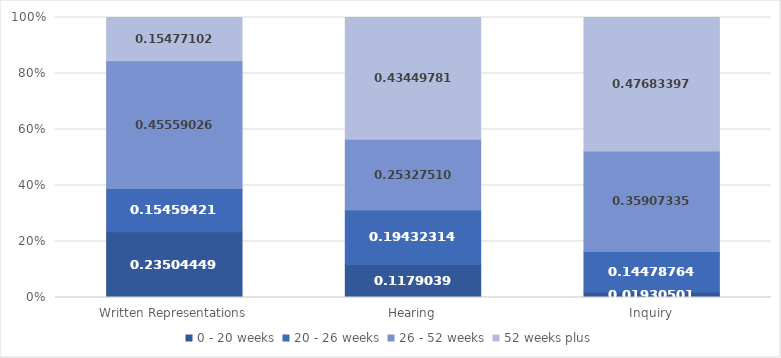
| Category | 0 - 20 weeks | 20 - 26 weeks | 26 - 52 weeks | 52 weeks plus |
|---|---|---|---|---|
| Written Representations | 0.235 | 0.155 | 0.456 | 0.155 |
| Hearing | 0.118 | 0.194 | 0.253 | 0.434 |
| Inquiry | 0.019 | 0.145 | 0.359 | 0.477 |